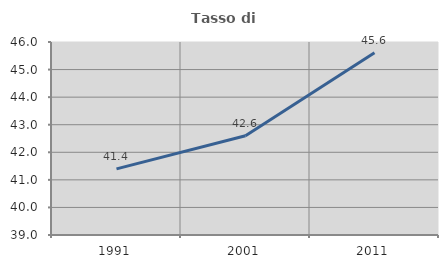
| Category | Tasso di occupazione   |
|---|---|
| 1991.0 | 41.397 |
| 2001.0 | 42.602 |
| 2011.0 | 45.614 |